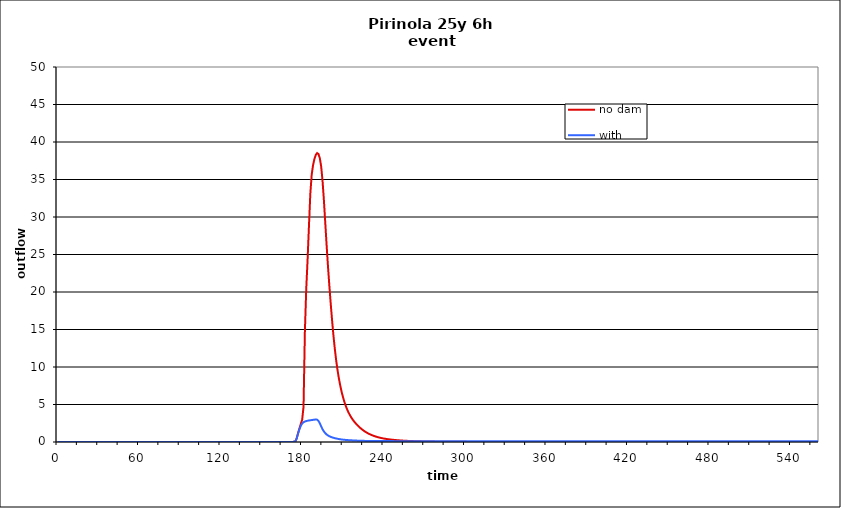
| Category | no dam | with dam |
|---|---|---|
| 0.0 | 0 | 0 |
| 1.0 | 0 | 0 |
| 2.0 | 0 | 0 |
| 3.0 | 0 | 0 |
| 4.0 | 0 | 0 |
| 5.0 | 0 | 0 |
| 6.0 | 0 | 0 |
| 7.0 | 0 | 0 |
| 8.0 | 0 | 0 |
| 9.0 | 0 | 0 |
| 10.0 | 0 | 0 |
| 11.0 | 0 | 0 |
| 12.0 | 0 | 0 |
| 13.0 | 0 | 0 |
| 14.0 | 0 | 0 |
| 15.0 | 0 | 0 |
| 16.0 | 0 | 0 |
| 17.0 | 0 | 0 |
| 18.0 | 0 | 0 |
| 19.0 | 0 | 0 |
| 20.0 | 0 | 0 |
| 21.0 | 0 | 0 |
| 22.0 | 0 | 0 |
| 23.0 | 0 | 0 |
| 24.0 | 0 | 0 |
| 25.0 | 0 | 0 |
| 26.0 | 0 | 0 |
| 27.0 | 0 | 0 |
| 28.0 | 0 | 0 |
| 29.0 | 0 | 0 |
| 30.0 | 0 | 0 |
| 31.0 | 0 | 0 |
| 32.0 | 0 | 0 |
| 33.0 | 0 | 0 |
| 34.0 | 0 | 0 |
| 35.0 | 0 | 0 |
| 36.0 | 0 | 0 |
| 37.0 | 0 | 0 |
| 38.0 | 0 | 0 |
| 39.0 | 0 | 0 |
| 40.0 | 0 | 0 |
| 41.0 | 0 | 0 |
| 42.0 | 0 | 0 |
| 43.0 | 0 | 0 |
| 44.0 | 0 | 0 |
| 45.0 | 0 | 0 |
| 46.0 | 0 | 0 |
| 47.0 | 0 | 0 |
| 48.0 | 0 | 0 |
| 49.0 | 0 | 0 |
| 50.0 | 0 | 0 |
| 51.0 | 0 | 0 |
| 52.0 | 0 | 0 |
| 53.0 | 0 | 0 |
| 54.0 | 0 | 0 |
| 55.0 | 0 | 0 |
| 56.0 | 0 | 0 |
| 57.0 | 0 | 0 |
| 58.0 | 0 | 0 |
| 59.0 | 0 | 0 |
| 60.0 | 0 | 0 |
| 61.0 | 0 | 0 |
| 62.0 | 0 | 0 |
| 63.0 | 0 | 0 |
| 64.0 | 0 | 0 |
| 65.0 | 0 | 0 |
| 66.0 | 0 | 0 |
| 67.0 | 0 | 0 |
| 68.0 | 0 | 0 |
| 69.0 | 0 | 0 |
| 70.0 | 0 | 0 |
| 71.0 | 0 | 0 |
| 72.0 | 0 | 0 |
| 73.0 | 0 | 0 |
| 74.0 | 0 | 0 |
| 75.0 | 0 | 0 |
| 76.0 | 0 | 0 |
| 77.0 | 0 | 0 |
| 78.0 | 0 | 0 |
| 79.0 | 0 | 0 |
| 80.0 | 0 | 0 |
| 81.0 | 0 | 0 |
| 82.0 | 0 | 0 |
| 83.0 | 0 | 0 |
| 84.0 | 0 | 0 |
| 85.0 | 0 | 0 |
| 86.0 | 0 | 0 |
| 87.0 | 0 | 0 |
| 88.0 | 0 | 0 |
| 89.0 | 0 | 0 |
| 90.0 | 0 | 0 |
| 91.0 | 0 | 0 |
| 92.0 | 0 | 0 |
| 93.0 | 0 | 0 |
| 94.0 | 0 | 0 |
| 95.0 | 0 | 0 |
| 96.0 | 0 | 0 |
| 97.0 | 0 | 0 |
| 98.0 | 0 | 0 |
| 99.0 | 0 | 0 |
| 100.0 | 0 | 0 |
| 101.0 | 0 | 0 |
| 102.0 | 0 | 0 |
| 103.0 | 0 | 0 |
| 104.0 | 0 | 0 |
| 105.0 | 0 | 0 |
| 106.0 | 0 | 0 |
| 107.0 | 0 | 0 |
| 108.0 | 0 | 0 |
| 109.0 | 0 | 0 |
| 110.0 | 0 | 0 |
| 111.0 | 0 | 0 |
| 112.0 | 0 | 0 |
| 113.0 | 0 | 0 |
| 114.0 | 0 | 0 |
| 115.0 | 0 | 0 |
| 116.0 | 0 | 0 |
| 117.0 | 0 | 0 |
| 118.0 | 0 | 0 |
| 119.0 | 0 | 0 |
| 120.0 | 0 | 0 |
| 121.0 | 0 | 0 |
| 122.0 | 0 | 0 |
| 123.0 | 0 | 0 |
| 124.0 | 0 | 0 |
| 125.0 | 0 | 0 |
| 126.0 | 0 | 0 |
| 127.0 | 0 | 0 |
| 128.0 | 0 | 0 |
| 129.0 | 0 | 0 |
| 130.0 | 0 | 0 |
| 131.0 | 0 | 0 |
| 132.0 | 0 | 0 |
| 133.0 | 0 | 0 |
| 134.0 | 0 | 0 |
| 135.0 | 0 | 0 |
| 136.0 | 0 | 0 |
| 137.0 | 0 | 0 |
| 138.0 | 0 | 0 |
| 139.0 | 0 | 0 |
| 140.0 | 0 | 0 |
| 141.0 | 0 | 0 |
| 142.0 | 0 | 0 |
| 143.0 | 0 | 0 |
| 144.0 | 0 | 0 |
| 145.0 | 0 | 0 |
| 146.0 | 0 | 0 |
| 147.0 | 0 | 0 |
| 148.0 | 0 | 0 |
| 149.0 | 0 | 0 |
| 150.0 | 0 | 0 |
| 151.0 | 0 | 0 |
| 152.0 | 0 | 0 |
| 153.0 | 0 | 0 |
| 154.0 | 0 | 0 |
| 155.0 | 0 | 0 |
| 156.0 | 0 | 0 |
| 157.0 | 0 | 0 |
| 158.0 | 0 | 0 |
| 159.0 | 0 | 0 |
| 160.0 | 0 | 0 |
| 161.0 | 0 | 0 |
| 162.0 | 0 | 0 |
| 163.0 | 0 | 0 |
| 164.0 | 0 | 0 |
| 165.0 | 0 | 0 |
| 166.0 | 0 | 0 |
| 167.0 | 0 | 0 |
| 168.0 | 0 | 0 |
| 169.0 | 0 | 0 |
| 170.0 | 0 | 0 |
| 171.0 | 0 | 0 |
| 172.0 | 0.002 | 0.002 |
| 173.0 | 0.01 | 0.01 |
| 174.0 | 0.031 | 0.031 |
| 175.0 | 0.076 | 0.077 |
| 176.0 | 0.507 | 0.475 |
| 177.0 | 1.202 | 1.145 |
| 178.0 | 1.812 | 1.715 |
| 179.0 | 2.402 | 2.163 |
| 180.0 | 2.964 | 2.466 |
| 181.0 | 4.679 | 2.633 |
| 182.0 | 14.725 | 2.731 |
| 183.0 | 20.424 | 2.793 |
| 184.0 | 24.348 | 2.835 |
| 185.0 | 28.852 | 2.868 |
| 186.0 | 33.085 | 2.898 |
| 187.0 | 35.625 | 2.926 |
| 188.0 | 36.906 | 2.952 |
| 189.0 | 37.715 | 2.978 |
| 190.0 | 38.277 | 3.003 |
| 191.0 | 38.522 | 2.976 |
| 192.0 | 38.395 | 2.806 |
| 193.0 | 37.835 | 2.495 |
| 194.0 | 36.72 | 2.077 |
| 195.0 | 34.818 | 1.698 |
| 196.0 | 32.234 | 1.402 |
| 197.0 | 29.245 | 1.177 |
| 198.0 | 26.23 | 1.005 |
| 199.0 | 23.418 | 0.871 |
| 200.0 | 20.861 | 0.768 |
| 201.0 | 18.477 | 0.687 |
| 202.0 | 16.268 | 0.62 |
| 203.0 | 14.255 | 0.563 |
| 204.0 | 12.473 | 0.514 |
| 205.0 | 10.932 | 0.47 |
| 206.0 | 9.622 | 0.43 |
| 207.0 | 8.506 | 0.395 |
| 208.0 | 7.554 | 0.363 |
| 209.0 | 6.73 | 0.336 |
| 210.0 | 6.016 | 0.313 |
| 211.0 | 5.398 | 0.294 |
| 212.0 | 4.862 | 0.277 |
| 213.0 | 4.392 | 0.263 |
| 214.0 | 3.986 | 0.249 |
| 215.0 | 3.63 | 0.237 |
| 216.0 | 3.318 | 0.225 |
| 217.0 | 3.041 | 0.214 |
| 218.0 | 2.793 | 0.204 |
| 219.0 | 2.57 | 0.195 |
| 220.0 | 2.364 | 0.186 |
| 221.0 | 2.175 | 0.178 |
| 222.0 | 2.001 | 0.171 |
| 223.0 | 1.838 | 0.165 |
| 224.0 | 1.69 | 0.159 |
| 225.0 | 1.552 | 0.154 |
| 226.0 | 1.425 | 0.149 |
| 227.0 | 1.309 | 0.145 |
| 228.0 | 1.203 | 0.141 |
| 229.0 | 1.107 | 0.137 |
| 230.0 | 1.019 | 0.134 |
| 231.0 | 0.939 | 0.132 |
| 232.0 | 0.865 | 0.129 |
| 233.0 | 0.798 | 0.127 |
| 234.0 | 0.737 | 0.126 |
| 235.0 | 0.681 | 0.124 |
| 236.0 | 0.629 | 0.123 |
| 237.0 | 0.582 | 0.122 |
| 238.0 | 0.539 | 0.121 |
| 239.0 | 0.5 | 0.12 |
| 240.0 | 0.465 | 0.119 |
| 241.0 | 0.434 | 0.119 |
| 242.0 | 0.405 | 0.118 |
| 243.0 | 0.378 | 0.118 |
| 244.0 | 0.354 | 0.117 |
| 245.0 | 0.331 | 0.117 |
| 246.0 | 0.31 | 0.117 |
| 247.0 | 0.29 | 0.117 |
| 248.0 | 0.272 | 0.116 |
| 249.0 | 0.255 | 0.116 |
| 250.0 | 0.239 | 0.116 |
| 251.0 | 0.224 | 0.116 |
| 252.0 | 0.211 | 0.116 |
| 253.0 | 0.198 | 0.116 |
| 254.0 | 0.186 | 0.115 |
| 255.0 | 0.175 | 0.115 |
| 256.0 | 0.164 | 0.115 |
| 257.0 | 0.155 | 0.115 |
| 258.0 | 0.146 | 0.115 |
| 259.0 | 0.137 | 0.115 |
| 260.0 | 0.13 | 0.115 |
| 261.0 | 0.122 | 0.115 |
| 262.0 | 0.115 | 0.115 |
| 263.0 | 0.109 | 0.115 |
| 264.0 | 0.103 | 0.115 |
| 265.0 | 0.097 | 0.115 |
| 266.0 | 0.092 | 0.115 |
| 267.0 | 0.087 | 0.115 |
| 268.0 | 0.083 | 0.115 |
| 269.0 | 0.078 | 0.115 |
| 270.0 | 0.074 | 0.115 |
| 271.0 | 0.07 | 0.115 |
| 272.0 | 0.067 | 0.115 |
| 273.0 | 0.063 | 0.115 |
| 274.0 | 0.06 | 0.115 |
| 275.0 | 0.057 | 0.115 |
| 276.0 | 0.054 | 0.115 |
| 277.0 | 0.051 | 0.115 |
| 278.0 | 0.049 | 0.115 |
| 279.0 | 0.046 | 0.115 |
| 280.0 | 0.044 | 0.115 |
| 281.0 | 0.042 | 0.115 |
| 282.0 | 0.04 | 0.115 |
| 283.0 | 0.038 | 0.115 |
| 284.0 | 0.036 | 0.115 |
| 285.0 | 0.035 | 0.115 |
| 286.0 | 0.033 | 0.115 |
| 287.0 | 0.031 | 0.115 |
| 288.0 | 0.03 | 0.115 |
| 289.0 | 0.028 | 0.115 |
| 290.0 | 0.027 | 0.115 |
| 291.0 | 0.026 | 0.115 |
| 292.0 | 0.025 | 0.115 |
| 293.0 | 0.024 | 0.115 |
| 294.0 | 0.023 | 0.115 |
| 295.0 | 0.022 | 0.115 |
| 296.0 | 0.021 | 0.115 |
| 297.0 | 0.02 | 0.115 |
| 298.0 | 0.019 | 0.115 |
| 299.0 | 0.018 | 0.115 |
| 300.0 | 0.017 | 0.115 |
| 301.0 | 0.016 | 0.115 |
| 302.0 | 0.016 | 0.115 |
| 303.0 | 0.015 | 0.115 |
| 304.0 | 0.014 | 0.115 |
| 305.0 | 0.014 | 0.115 |
| 306.0 | 0.013 | 0.115 |
| 307.0 | 0.013 | 0.115 |
| 308.0 | 0.012 | 0.115 |
| 309.0 | 0.012 | 0.115 |
| 310.0 | 0.011 | 0.114 |
| 311.0 | 0.011 | 0.114 |
| 312.0 | 0.01 | 0.114 |
| 313.0 | 0.01 | 0.114 |
| 314.0 | 0.009 | 0.114 |
| 315.0 | 0.009 | 0.114 |
| 316.0 | 0.008 | 0.114 |
| 317.0 | 0.008 | 0.114 |
| 318.0 | 0.008 | 0.114 |
| 319.0 | 0.007 | 0.114 |
| 320.0 | 0.007 | 0.114 |
| 321.0 | 0.007 | 0.114 |
| 322.0 | 0.006 | 0.114 |
| 323.0 | 0.006 | 0.114 |
| 324.0 | 0.006 | 0.114 |
| 325.0 | 0.005 | 0.114 |
| 326.0 | 0.005 | 0.114 |
| 327.0 | 0.005 | 0.114 |
| 328.0 | 0.005 | 0.114 |
| 329.0 | 0.004 | 0.114 |
| 330.0 | 0.004 | 0.114 |
| 331.0 | 0.004 | 0.114 |
| 332.0 | 0.004 | 0.114 |
| 333.0 | 0.004 | 0.114 |
| 334.0 | 0.003 | 0.114 |
| 335.0 | 0.003 | 0.114 |
| 336.0 | 0.003 | 0.114 |
| 337.0 | 0.003 | 0.114 |
| 338.0 | 0.003 | 0.114 |
| 339.0 | 0.003 | 0.114 |
| 340.0 | 0.002 | 0.114 |
| 341.0 | 0.002 | 0.114 |
| 342.0 | 0.002 | 0.114 |
| 343.0 | 0.002 | 0.114 |
| 344.0 | 0.002 | 0.114 |
| 345.0 | 0.002 | 0.114 |
| 346.0 | 0.002 | 0.114 |
| 347.0 | 0.002 | 0.114 |
| 348.0 | 0.001 | 0.114 |
| 349.0 | 0.001 | 0.114 |
| 350.0 | 0.001 | 0.114 |
| 351.0 | 0.001 | 0.114 |
| 352.0 | 0.001 | 0.114 |
| 353.0 | 0.001 | 0.114 |
| 354.0 | 0.001 | 0.114 |
| 355.0 | 0.001 | 0.114 |
| 356.0 | 0.001 | 0.114 |
| 357.0 | 0.001 | 0.114 |
| 358.0 | 0.001 | 0.114 |
| 359.0 | 0.001 | 0.114 |
| 360.0 | 0.001 | 0.114 |
| 361.0 | 0.001 | 0.114 |
| 362.0 | 0.001 | 0.114 |
| 363.0 | 0 | 0.114 |
| 364.0 | 0 | 0.114 |
| 365.0 | 0 | 0.114 |
| 366.0 | 0 | 0.114 |
| 367.0 | 0 | 0.114 |
| 368.0 | 0 | 0.114 |
| 369.0 | 0 | 0.114 |
| 370.0 | 0 | 0.114 |
| 371.0 | 0 | 0.114 |
| 372.0 | 0 | 0.114 |
| 373.0 | 0 | 0.114 |
| 374.0 | 0 | 0.114 |
| 375.0 | 0 | 0.114 |
| 376.0 | 0 | 0.114 |
| 377.0 | 0 | 0.114 |
| 378.0 | 0 | 0.114 |
| 379.0 | 0 | 0.114 |
| 380.0 | 0 | 0.114 |
| 381.0 | 0 | 0.114 |
| 382.0 | 0 | 0.114 |
| 383.0 | 0 | 0.114 |
| 384.0 | 0 | 0.114 |
| 385.0 | 0 | 0.114 |
| 386.0 | 0 | 0.114 |
| 387.0 | 0 | 0.114 |
| 388.0 | 0 | 0.114 |
| 389.0 | 0 | 0.114 |
| 390.0 | 0 | 0.114 |
| 391.0 | 0 | 0.114 |
| 392.0 | 0 | 0.114 |
| 393.0 | 0 | 0.114 |
| 394.0 | 0 | 0.114 |
| 395.0 | 0 | 0.114 |
| 396.0 | 0 | 0.114 |
| 397.0 | 0 | 0.114 |
| 398.0 | 0 | 0.114 |
| 399.0 | 0 | 0.114 |
| 400.0 | 0 | 0.114 |
| 401.0 | 0 | 0.114 |
| 402.0 | 0 | 0.114 |
| 403.0 | 0 | 0.114 |
| 404.0 | 0 | 0.114 |
| 405.0 | 0 | 0.114 |
| 406.0 | 0 | 0.114 |
| 407.0 | 0 | 0.113 |
| 408.0 | 0 | 0.113 |
| 409.0 | 0 | 0.113 |
| 410.0 | 0 | 0.113 |
| 411.0 | 0 | 0.113 |
| 412.0 | 0 | 0.113 |
| 413.0 | 0 | 0.113 |
| 414.0 | 0 | 0.113 |
| 415.0 | 0 | 0.113 |
| 416.0 | 0 | 0.113 |
| 417.0 | 0 | 0.113 |
| 418.0 | 0 | 0.113 |
| 419.0 | 0 | 0.113 |
| 420.0 | 0 | 0.113 |
| 421.0 | 0 | 0.113 |
| 422.0 | 0 | 0.113 |
| 423.0 | 0 | 0.113 |
| 424.0 | 0 | 0.113 |
| 425.0 | 0 | 0.113 |
| 426.0 | 0 | 0.113 |
| 427.0 | 0 | 0.113 |
| 428.0 | 0 | 0.113 |
| 429.0 | 0 | 0.113 |
| 430.0 | 0 | 0.113 |
| 431.0 | 0 | 0.113 |
| 432.0 | 0 | 0.113 |
| 433.0 | 0 | 0.113 |
| 434.0 | 0 | 0.113 |
| 435.0 | 0 | 0.113 |
| 436.0 | 0 | 0.113 |
| 437.0 | 0 | 0.113 |
| 438.0 | 0 | 0.113 |
| 439.0 | 0 | 0.113 |
| 440.0 | 0 | 0.113 |
| 441.0 | 0 | 0.113 |
| 442.0 | 0 | 0.113 |
| 443.0 | 0 | 0.113 |
| 444.0 | 0 | 0.113 |
| 445.0 | 0 | 0.113 |
| 446.0 | 0 | 0.113 |
| 447.0 | 0 | 0.113 |
| 448.0 | 0 | 0.113 |
| 449.0 | 0 | 0.113 |
| 450.0 | 0 | 0.113 |
| 451.0 | 0 | 0.113 |
| 452.0 | 0 | 0.113 |
| 453.0 | 0 | 0.113 |
| 454.0 | 0 | 0.113 |
| 455.0 | 0 | 0.113 |
| 456.0 | 0 | 0.113 |
| 457.0 | 0 | 0.113 |
| 458.0 | 0 | 0.113 |
| 459.0 | 0 | 0.113 |
| 460.0 | 0 | 0.113 |
| 461.0 | 0 | 0.113 |
| 462.0 | 0 | 0.113 |
| 463.0 | 0 | 0.113 |
| 464.0 | 0 | 0.113 |
| 465.0 | 0 | 0.113 |
| 466.0 | 0 | 0.113 |
| 467.0 | 0 | 0.113 |
| 468.0 | 0 | 0.113 |
| 469.0 | 0 | 0.113 |
| 470.0 | 0 | 0.113 |
| 471.0 | 0 | 0.113 |
| 472.0 | 0 | 0.113 |
| 473.0 | 0 | 0.113 |
| 474.0 | 0 | 0.113 |
| 475.0 | 0 | 0.113 |
| 476.0 | 0 | 0.113 |
| 477.0 | 0 | 0.113 |
| 478.0 | 0 | 0.113 |
| 479.0 | 0 | 0.113 |
| 480.0 | 0 | 0.113 |
| 481.0 | 0 | 0.113 |
| 482.0 | 0 | 0.113 |
| 483.0 | 0 | 0.113 |
| 484.0 | 0 | 0.113 |
| 485.0 | 0 | 0.112 |
| 486.0 | 0 | 0.112 |
| 487.0 | 0 | 0.112 |
| 488.0 | 0 | 0.112 |
| 489.0 | 0 | 0.112 |
| 490.0 | 0 | 0.112 |
| 491.0 | 0 | 0.112 |
| 492.0 | 0 | 0.112 |
| 493.0 | 0 | 0.112 |
| 494.0 | 0 | 0.112 |
| 495.0 | 0 | 0.112 |
| 496.0 | 0 | 0.112 |
| 497.0 | 0 | 0.112 |
| 498.0 | 0 | 0.112 |
| 499.0 | 0 | 0.112 |
| 500.0 | 0 | 0.112 |
| 501.0 | 0 | 0.112 |
| 502.0 | 0 | 0.112 |
| 503.0 | 0 | 0.112 |
| 504.0 | 0 | 0.112 |
| 505.0 | 0 | 0.112 |
| 506.0 | 0 | 0.112 |
| 507.0 | 0 | 0.112 |
| 508.0 | 0 | 0.112 |
| 509.0 | 0 | 0.112 |
| 510.0 | 0 | 0.112 |
| 511.0 | 0 | 0.112 |
| 512.0 | 0 | 0.112 |
| 513.0 | 0 | 0.112 |
| 514.0 | 0 | 0.112 |
| 515.0 | 0 | 0.112 |
| 516.0 | 0 | 0.112 |
| 517.0 | 0 | 0.112 |
| 518.0 | 0 | 0.112 |
| 519.0 | 0 | 0.112 |
| 520.0 | 0 | 0.112 |
| 521.0 | 0 | 0.112 |
| 522.0 | 0 | 0.112 |
| 523.0 | 0 | 0.112 |
| 524.0 | 0 | 0.112 |
| 525.0 | 0 | 0.112 |
| 526.0 | 0 | 0.112 |
| 527.0 | 0 | 0.112 |
| 528.0 | 0 | 0.112 |
| 529.0 | 0 | 0.112 |
| 530.0 | 0 | 0.112 |
| 531.0 | 0 | 0.112 |
| 532.0 | 0 | 0.112 |
| 533.0 | 0 | 0.112 |
| 534.0 | 0 | 0.112 |
| 535.0 | 0 | 0.112 |
| 536.0 | 0 | 0.112 |
| 537.0 | 0 | 0.112 |
| 538.0 | 0 | 0.112 |
| 539.0 | 0 | 0.112 |
| 540.0 | 0 | 0.112 |
| 541.0 | 0 | 0.112 |
| 542.0 | 0 | 0.112 |
| 543.0 | 0 | 0.112 |
| 544.0 | 0 | 0.112 |
| 545.0 | 0 | 0.112 |
| 546.0 | 0 | 0.112 |
| 547.0 | 0 | 0.112 |
| 548.0 | 0 | 0.112 |
| 549.0 | 0 | 0.112 |
| 550.0 | 0 | 0.112 |
| 551.0 | 0 | 0.112 |
| 552.0 | 0 | 0.112 |
| 553.0 | 0 | 0.112 |
| 554.0 | 0 | 0.112 |
| 555.0 | 0 | 0.112 |
| 556.0 | 0 | 0.112 |
| 557.0 | 0 | 0.112 |
| 558.0 | 0 | 0.112 |
| 559.0 | 0 | 0.112 |
| 560.0 | 0 | 0.112 |